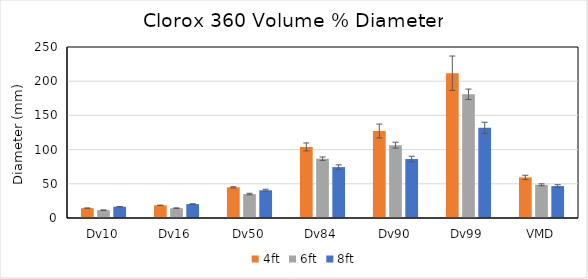
| Category | 4ft | 6ft | 8ft |
|---|---|---|---|
| Dv10 | 14.381 | 11.394 | 16.432 |
| Dv16 | 18.488 | 14.363 | 20.313 |
| Dv50 | 44.863 | 34.989 | 40.526 |
| Dv84 | 103.916 | 86.681 | 74.4 |
| Dv90 | 127.207 | 106.479 | 86.216 |
| Dv99 | 211.644 | 180.832 | 131.77 |
| VMD | 59.326 | 48.488 | 46.679 |